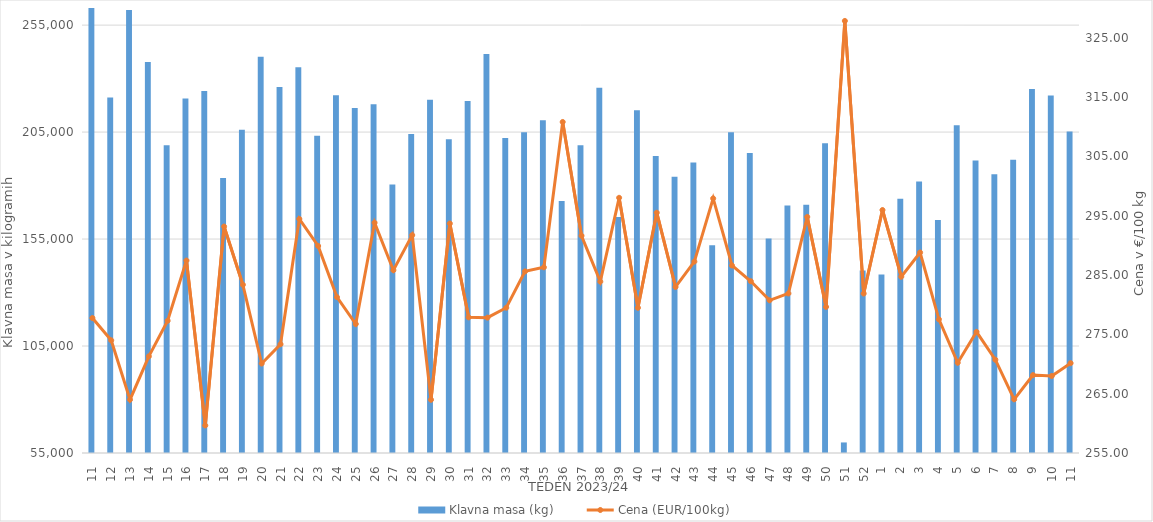
| Category | Klavna masa (kg) |
|---|---|
| 11.0 | 265476 |
| 12.0 | 221171 |
| 13.0 | 262102 |
| 14.0 | 237813 |
| 15.0 | 198828 |
| 16.0 | 220686 |
| 17.0 | 224192 |
| 18.0 | 183508 |
| 19.0 | 206133 |
| 20.0 | 240223 |
| 21.0 | 226050 |
| 22.0 | 235273 |
| 23.0 | 203306 |
| 24.0 | 222178 |
| 25.0 | 216259 |
| 26.0 | 218064 |
| 27.0 | 180556 |
| 28.0 | 204078 |
| 29.0 | 220162 |
| 30.0 | 201649 |
| 31.0 | 219538 |
| 32.0 | 241549 |
| 33.0 | 202261 |
| 34.0 | 204903 |
| 35.0 | 210575 |
| 36.0 | 172745 |
| 37.0 | 198877 |
| 38.0 | 225730 |
| 39.0 | 165273 |
| 40.0 | 215175 |
| 41.0 | 193769 |
| 42.0 | 184122 |
| 43.0 | 190834 |
| 44.0 | 152119 |
| 45.0 | 204974 |
| 46.0 | 195179 |
| 47.0 | 155300 |
| 48.0 | 170687 |
| 49.0 | 171040 |
| 50.0 | 199802 |
| 51.0 | 59936 |
| 52.0 | 140361 |
| 1.0 | 138450 |
| 2.0 | 173833 |
| 3.0 | 181907 |
| 4.0 | 163901 |
| 5.0 | 208207 |
| 6.0 | 191770 |
| 7.0 | 185347 |
| 8.0 | 192049 |
| 9.0 | 225097 |
| 10.0 | 222116 |
| 11.0 | 205236 |